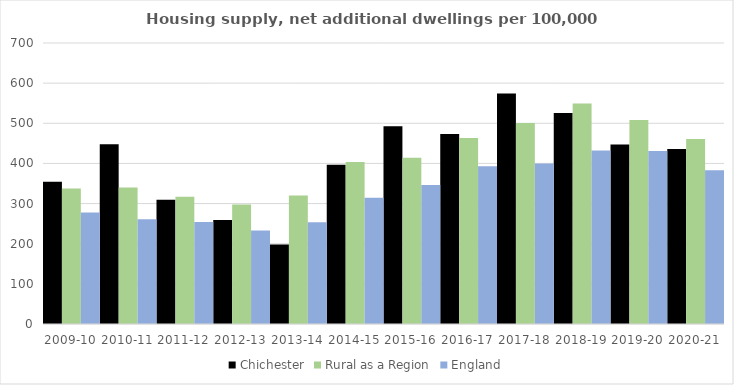
| Category | Chichester | Rural as a Region | England |
|---|---|---|---|
| 2009-10 | 354.393 | 337.852 | 277.548 |
| 2010-11 | 447.576 | 340.105 | 260.994 |
| 2011-12 | 309.663 | 317.04 | 254.007 |
| 2012-13 | 259.358 | 297.763 | 233.153 |
| 2013-14 | 197.755 | 319.835 | 253.602 |
| 2014-15 | 396.522 | 403.796 | 314.256 |
| 2015-16 | 492.427 | 414.091 | 346.154 |
| 2016-17 | 473.452 | 463.209 | 393.256 |
| 2017-18 | 574.081 | 500.68 | 399.646 |
| 2018-19 | 525.88 | 549.491 | 432.099 |
| 2019-20 | 447.457 | 508.493 | 431.187 |
| 2020-21 | 436.185 | 461.114 | 382.827 |